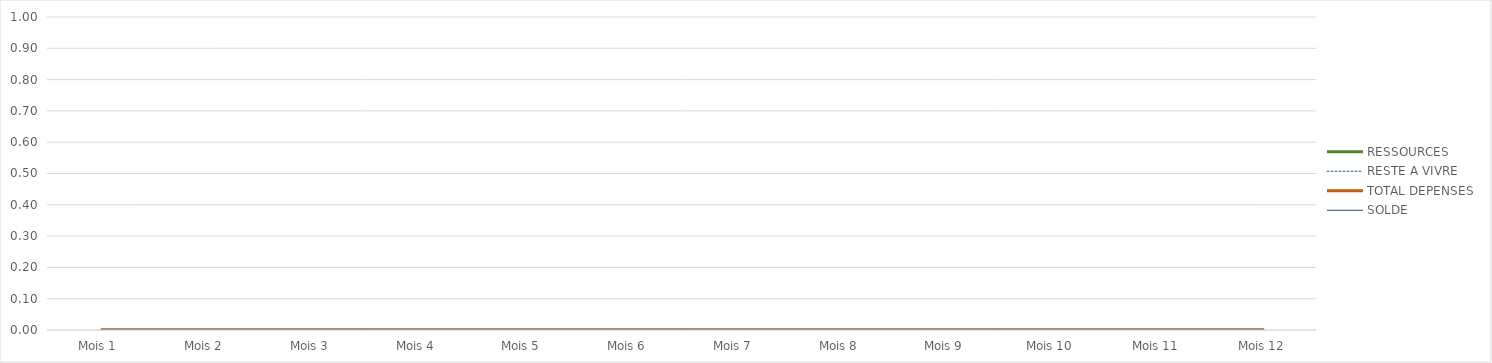
| Category | RESSOURCES | RESTE A VIVRE | Courses | Habillement | Maison | Animaux | Loisirs | Autres dépenses | TOTAL DEPENSES | SOLDE |
|---|---|---|---|---|---|---|---|---|---|---|
| Mois 1 | 0 | 0 |  |  |  |  |  |  | 0 | 0 |
| Mois 2 | 0 | 0 |  |  |  |  |  |  | 0 | 0 |
| Mois 3 | 0 | 0 |  |  |  |  |  |  | 0 | 0 |
| Mois 4 | 0 | 0 |  |  |  |  |  |  | 0 | 0 |
| Mois 5 | 0 | 0 |  |  |  |  |  |  | 0 | 0 |
| Mois 6 | 0 | 0 |  |  |  |  |  |  | 0 | 0 |
| Mois 7 | 0 | 0 |  |  |  |  |  |  | 0 | 0 |
| Mois 8 | 0 | 0 |  |  |  |  |  |  | 0 | 0 |
| Mois 9 | 0 | 0 |  |  |  |  |  |  | 0 | 0 |
| Mois 10 | 0 | 0 |  |  |  |  |  |  | 0 | 0 |
| Mois 11 | 0 | 0 |  |  |  |  |  |  | 0 | 0 |
| Mois 12 | 0 | 0 |  |  |  |  |  |  | 0 | 0 |